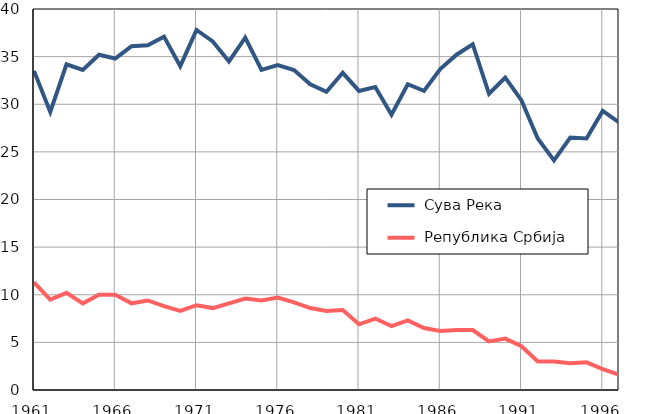
| Category |  Сува Река |  Република Србија |
|---|---|---|
| 1961.0 | 33.5 | 11.3 |
| 1962.0 | 29.2 | 9.5 |
| 1963.0 | 34.2 | 10.2 |
| 1964.0 | 33.6 | 9.1 |
| 1965.0 | 35.2 | 10 |
| 1966.0 | 34.8 | 10 |
| 1967.0 | 36.1 | 9.1 |
| 1968.0 | 36.2 | 9.4 |
| 1969.0 | 37.1 | 8.8 |
| 1970.0 | 34 | 8.3 |
| 1971.0 | 37.8 | 8.9 |
| 1972.0 | 36.6 | 8.6 |
| 1973.0 | 34.5 | 9.1 |
| 1974.0 | 37 | 9.6 |
| 1975.0 | 33.6 | 9.4 |
| 1976.0 | 34.1 | 9.7 |
| 1977.0 | 33.6 | 9.2 |
| 1978.0 | 32.1 | 8.6 |
| 1979.0 | 31.3 | 8.3 |
| 1980.0 | 33.3 | 8.4 |
| 1981.0 | 31.4 | 6.9 |
| 1982.0 | 31.8 | 7.5 |
| 1983.0 | 28.9 | 6.7 |
| 1984.0 | 32.1 | 7.3 |
| 1985.0 | 31.4 | 6.5 |
| 1986.0 | 33.7 | 6.2 |
| 1987.0 | 35.2 | 6.3 |
| 1988.0 | 36.3 | 6.3 |
| 1989.0 | 31.1 | 5.1 |
| 1990.0 | 32.8 | 5.4 |
| 1991.0 | 30.4 | 4.6 |
| 1992.0 | 26.4 | 3 |
| 1993.0 | 24.1 | 3 |
| 1994.0 | 26.5 | 2.8 |
| 1995.0 | 26.4 | 2.9 |
| 1996.0 | 29.3 | 2.2 |
| 1997.0 | 28.1 | 1.6 |